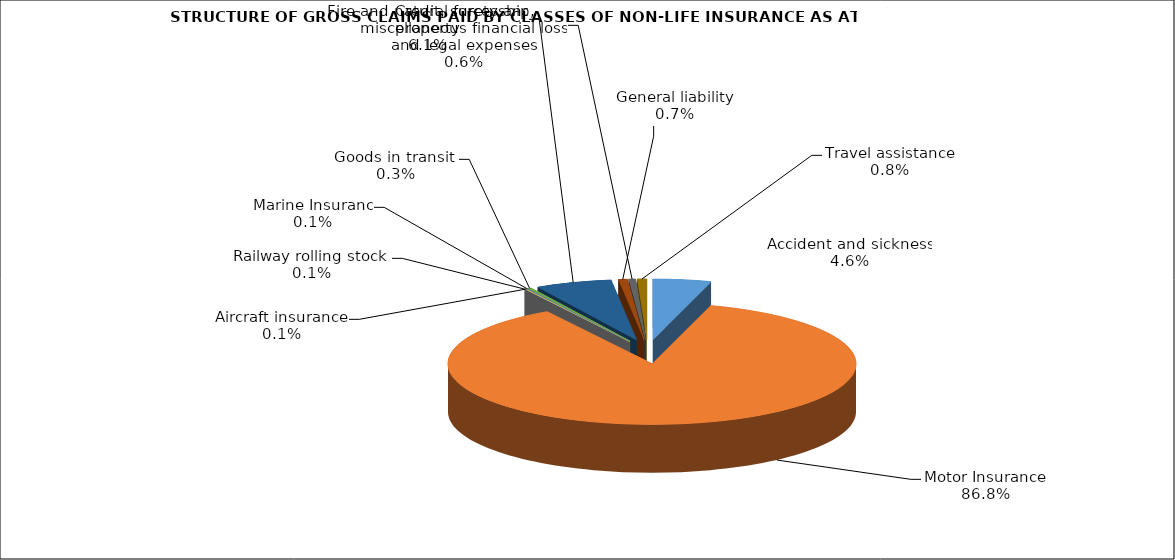
| Category | Accident and sickness | Series 1 |
|---|---|---|
| Accident and sickness | 0.046 |  |
| Motor Insurance | 0.868 |  |
| Railway rolling stock  | 0.001 |  |
| Aircraft insurance | 0.001 |  |
| Marine Insuranc | 0.001 |  |
| Goods in transit  | 0.003 |  |
| Fire and natural forces and property | 0.061 |  |
| General liability | 0.007 |  |
| Credit, suretyship, miscellaneous financial loss and legal expenses | 0.006 |  |
| Travel assistance | 0.008 |  |